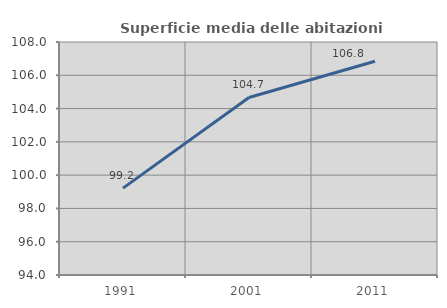
| Category | Superficie media delle abitazioni occupate |
|---|---|
| 1991.0 | 99.221 |
| 2001.0 | 104.669 |
| 2011.0 | 106.843 |